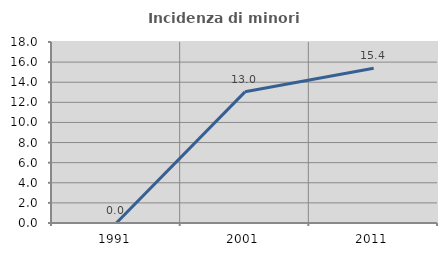
| Category | Incidenza di minori stranieri |
|---|---|
| 1991.0 | 0 |
| 2001.0 | 13.043 |
| 2011.0 | 15.385 |